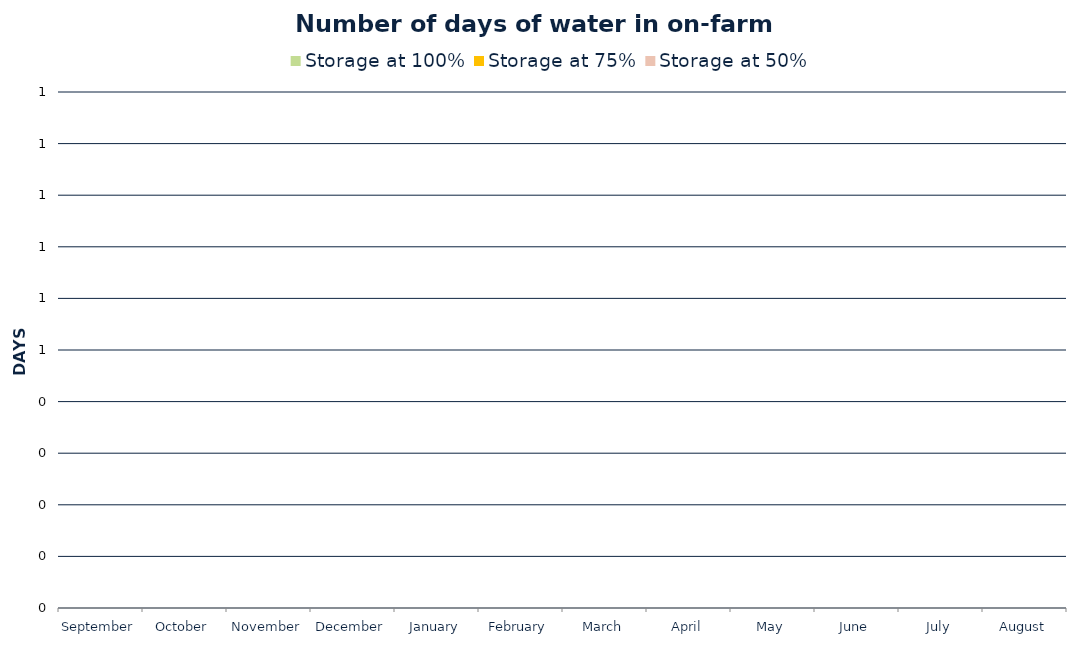
| Category | Storage at 100% | Storage at 75% | Storage at 50% |
|---|---|---|---|
| September | 0 | 0 | 0 |
| October | 0 | 0 | 0 |
| November | 0 | 0 | 0 |
| December | 0 | 0 | 0 |
| January | 0 | 0 | 0 |
| February | 0 | 0 | 0 |
| March | 0 | 0 | 0 |
| April | 0 | 0 | 0 |
| May | 0 | 0 | 0 |
| June | 0 | 0 | 0 |
| July | 0 | 0 | 0 |
| August | 0 | 0 | 0 |